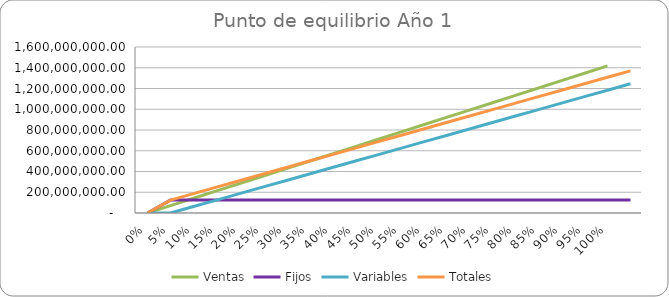
| Category | Ventas | Fijos | Variables | Totales |
|---|---|---|---|---|
| 0.0 | 0 | 0 | 0 | 0 |
| 0.05 | 70875000 | 124534131.045 | 0 | 124534131.045 |
| 0.1 | 141750000 | 124534131.045 | 62290558.597 | 186824689.642 |
| 0.15 | 212625000 | 124534131.045 | 124581117.194 | 249115248.239 |
| 0.2 | 283500000 | 124534131.045 | 186871675.79 | 311405806.836 |
| 0.25 | 354375000 | 124534131.045 | 249162234.387 | 373696365.433 |
| 0.3 | 425250000 | 124534131.045 | 311452792.984 | 435986924.029 |
| 0.35 | 496125000 | 124534131.045 | 373743351.581 | 498277482.626 |
| 0.4 | 567000000 | 124534131.045 | 436033910.178 | 560568041.223 |
| 0.45 | 637875000 | 124534131.045 | 498324468.774 | 622858599.82 |
| 0.5 | 708750000 | 124534131.045 | 560615027.371 | 685149158.417 |
| 0.55 | 779625000 | 124534131.045 | 622905585.968 | 747439717.013 |
| 0.6 | 850500000 | 124534131.045 | 685196144.565 | 809730275.61 |
| 0.65 | 921375000 | 124534131.045 | 747486703.161 | 872020834.207 |
| 0.7 | 992250000 | 124534131.045 | 809777261.758 | 934311392.804 |
| 0.75 | 1063125000 | 124534131.045 | 872067820.355 | 996601951.4 |
| 0.8 | 1134000000 | 124534131.045 | 934358378.952 | 1058892509.997 |
| 0.85 | 1204875000 | 124534131.045 | 996648937.549 | 1121183068.594 |
| 0.9 | 1275750000 | 124534131.045 | 1058939496.145 | 1183473627.191 |
| 0.95 | 1346625000 | 124534131.045 | 1121230054.742 | 1245764185.788 |
| 1.0 | 1417500000 | 124534131.045 | 1183520613.339 | 1308054744.384 |